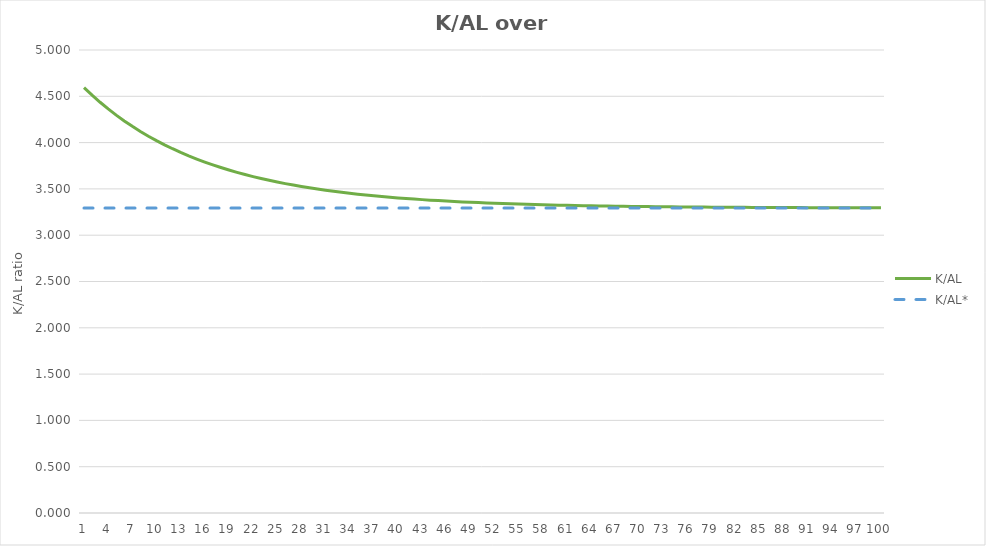
| Category | K/AL | K/AL* |
|---|---|---|
| 0 | 4.594 | 3.293 |
| 1 | 4.512 | 3.293 |
| 2 | 4.435 | 3.293 |
| 3 | 4.364 | 3.293 |
| 4 | 4.297 | 3.293 |
| 5 | 4.234 | 3.293 |
| 6 | 4.176 | 3.293 |
| 7 | 4.121 | 3.293 |
| 8 | 4.069 | 3.293 |
| 9 | 4.021 | 3.293 |
| 10 | 3.976 | 3.293 |
| 11 | 3.934 | 3.293 |
| 12 | 3.894 | 3.293 |
| 13 | 3.857 | 3.293 |
| 14 | 3.822 | 3.293 |
| 15 | 3.79 | 3.293 |
| 16 | 3.759 | 3.293 |
| 17 | 3.731 | 3.293 |
| 18 | 3.704 | 3.293 |
| 19 | 3.679 | 3.293 |
| 20 | 3.655 | 3.293 |
| 21 | 3.633 | 3.293 |
| 22 | 3.612 | 3.293 |
| 23 | 3.593 | 3.293 |
| 24 | 3.574 | 3.293 |
| 25 | 3.557 | 3.293 |
| 26 | 3.541 | 3.293 |
| 27 | 3.526 | 3.293 |
| 28 | 3.512 | 3.293 |
| 29 | 3.499 | 3.293 |
| 30 | 3.486 | 3.293 |
| 31 | 3.474 | 3.293 |
| 32 | 3.463 | 3.293 |
| 33 | 3.453 | 3.293 |
| 34 | 3.443 | 3.293 |
| 35 | 3.434 | 3.293 |
| 36 | 3.426 | 3.293 |
| 37 | 3.418 | 3.293 |
| 38 | 3.41 | 3.293 |
| 39 | 3.403 | 3.293 |
| 40 | 3.396 | 3.293 |
| 41 | 3.39 | 3.293 |
| 42 | 3.384 | 3.293 |
| 43 | 3.379 | 3.293 |
| 44 | 3.373 | 3.293 |
| 45 | 3.369 | 3.293 |
| 46 | 3.364 | 3.293 |
| 47 | 3.36 | 3.293 |
| 48 | 3.356 | 3.293 |
| 49 | 3.352 | 3.293 |
| 50 | 3.348 | 3.293 |
| 51 | 3.345 | 3.293 |
| 52 | 3.342 | 3.293 |
| 53 | 3.339 | 3.293 |
| 54 | 3.336 | 3.293 |
| 55 | 3.334 | 3.293 |
| 56 | 3.331 | 3.293 |
| 57 | 3.329 | 3.293 |
| 58 | 3.327 | 3.293 |
| 59 | 3.325 | 3.293 |
| 60 | 3.323 | 3.293 |
| 61 | 3.321 | 3.293 |
| 62 | 3.319 | 3.293 |
| 63 | 3.318 | 3.293 |
| 64 | 3.316 | 3.293 |
| 65 | 3.315 | 3.293 |
| 66 | 3.313 | 3.293 |
| 67 | 3.312 | 3.293 |
| 68 | 3.311 | 3.293 |
| 69 | 3.31 | 3.293 |
| 70 | 3.309 | 3.293 |
| 71 | 3.308 | 3.293 |
| 72 | 3.307 | 3.293 |
| 73 | 3.306 | 3.293 |
| 74 | 3.305 | 3.293 |
| 75 | 3.305 | 3.293 |
| 76 | 3.304 | 3.293 |
| 77 | 3.303 | 3.293 |
| 78 | 3.303 | 3.293 |
| 79 | 3.302 | 3.293 |
| 80 | 3.302 | 3.293 |
| 81 | 3.301 | 3.293 |
| 82 | 3.301 | 3.293 |
| 83 | 3.3 | 3.293 |
| 84 | 3.3 | 3.293 |
| 85 | 3.299 | 3.293 |
| 86 | 3.299 | 3.293 |
| 87 | 3.299 | 3.293 |
| 88 | 3.298 | 3.293 |
| 89 | 3.298 | 3.293 |
| 90 | 3.298 | 3.293 |
| 91 | 3.297 | 3.293 |
| 92 | 3.297 | 3.293 |
| 93 | 3.297 | 3.293 |
| 94 | 3.297 | 3.293 |
| 95 | 3.296 | 3.293 |
| 96 | 3.296 | 3.293 |
| 97 | 3.296 | 3.293 |
| 98 | 3.296 | 3.293 |
| 99 | 3.296 | 3.293 |